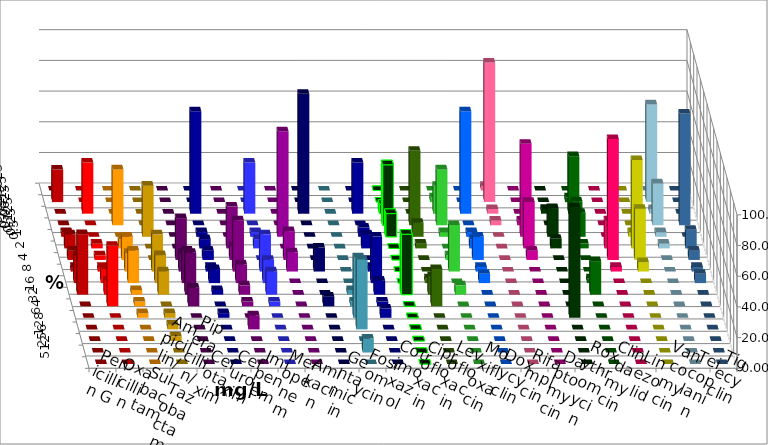
| Category | Penicillin G | Oxacillin | Ampicillin/ Sulbactam | Piperacillin/ Tazobactam | Cefotaxim | Cefuroxim | Imipenem | Meropenem | Amikacin | Gentamicin | Fosfomycin | Cotrimoxazol | Ciprofloxacin | Levofloxacin | Moxifloxacin | Doxycyclin | Rifampicin | Daptomycin | Roxythromycin | Clindamycin | Linezolid | Vancomycin | Teicoplanin | Tigecyclin |
|---|---|---|---|---|---|---|---|---|---|---|---|---|---|---|---|---|---|---|---|---|---|---|---|---|
| 0.015625 | 0 | 0 | 0 | 0 | 0 | 0 | 0 | 0 | 0 | 0 | 0 | 0 | 0 | 0 | 0 | 0 | 3.03 | 0 | 0 | 0 | 0 | 0 | 0 | 0 |
| 0.03125 | 21.212 | 0 | 0 | 0 | 0 | 0 | 0 | 0 | 0 | 0 | 0 | 0 | 0 | 0 | 3.03 | 0 | 90.909 | 0 | 0 | 3.125 | 0 | 0 | 0 | 63.636 |
| 0.0625 | 0 | 33.333 | 0 | 0 | 0 | 0 | 66.667 | 33.333 | 0 | 78.125 | 0 | 33.333 | 6.061 | 0 | 18.182 | 66.667 | 3.03 | 0 | 3.125 | 37.5 | 0 | 0 | 0 | 3.03 |
| 0.125 | 0 | 0 | 36.364 | 0 | 0 | 0 | 0 | 0 | 0 | 0 | 0 | 0 | 39.394 | 48.485 | 36.364 | 0 | 3.03 | 3.03 | 0 | 15.625 | 0 | 0 | 72.727 | 27.273 |
| 0.25 | 3.03 | 0 | 0 | 33.333 | 0 | 0 | 3.03 | 3.03 | 68.75 | 0 | 0 | 6.061 | 15.152 | 9.091 | 3.03 | 3.03 | 0 | 60.606 | 18.75 | 15.625 | 0 | 3.03 | 0 | 3.03 |
| 0.5 | 9.091 | 3.03 | 6.061 | 0 | 0 | 27.273 | 6.061 | 6.061 | 0 | 0 | 0 | 9.091 | 0 | 3.03 | 0 | 6.061 | 0 | 30.303 | 6.25 | 3.125 | 18.182 | 57.576 | 12.121 | 3.03 |
| 1.0 | 6.061 | 3.03 | 15.152 | 0 | 27.273 | 9.091 | 6.061 | 0 | 18.75 | 0 | 0 | 0 | 0 | 0 | 3.03 | 15.152 | 0 | 6.061 | 0 | 0 | 78.788 | 33.333 | 6.061 | 0 |
| 2.0 | 3.03 | 3.03 | 12.121 | 24.242 | 12.121 | 33.333 | 3.03 | 24.242 | 12.5 | 15.625 | 0 | 3.03 | 0 | 0 | 30.303 | 3.03 | 0 | 0 | 0 | 0 | 3.03 | 6.061 | 3.03 | 0 |
| 4.0 | 18.182 | 9.091 | 21.212 | 18.182 | 21.212 | 12.121 | 9.091 | 15.152 | 0 | 0 | 0 | 30.303 | 0 | 3.03 | 0 | 6.061 | 0 | 0 | 0 | 3.125 | 0 | 0 | 6.061 | 0 |
| 8.0 | 39.394 | 9.091 | 3.03 | 15.152 | 27.273 | 6.061 | 3.03 | 15.152 | 0 | 0 | 3.03 | 9.091 | 39.394 | 12.121 | 6.061 | 0 | 0 | 0 | 0 | 21.875 | 0 | 0 | 0 | 0 |
| 16.0 | 0 | 39.394 | 3.03 | 0 | 12.121 | 3.03 | 0 | 3.03 | 0 | 6.25 | 3.03 | 3.03 | 0 | 24.242 | 0 | 0 | 0 | 0 | 0 | 0 | 0 | 0 | 0 | 0 |
| 32.0 | 0 | 0 | 3.03 | 3.03 | 0 | 0 | 3.03 | 0 | 0 | 0 | 39.394 | 6.061 | 0 | 0 | 0 | 0 | 0 | 0 | 71.875 | 0 | 0 | 0 | 0 | 0 |
| 64.0 | 0 | 0 | 0 | 3.03 | 0 | 9.091 | 0 | 0 | 0 | 0 | 45.455 | 0 | 0 | 0 | 0 | 0 | 0 | 0 | 0 | 0 | 0 | 0 | 0 | 0 |
| 128.0 | 0 | 0 | 0 | 3.03 | 0 | 0 | 0 | 0 | 0 | 0 | 0 | 0 | 0 | 0 | 0 | 0 | 0 | 0 | 0 | 0 | 0 | 0 | 0 | 0 |
| 256.0 | 0 | 0 | 0 | 0 | 0 | 0 | 0 | 0 | 0 | 0 | 9.091 | 0 | 0 | 0 | 0 | 0 | 0 | 0 | 0 | 0 | 0 | 0 | 0 | 0 |
| 512.0 | 0 | 0 | 0 | 0 | 0 | 0 | 0 | 0 | 0 | 0 | 0 | 0 | 0 | 0 | 0 | 0 | 0 | 0 | 0 | 0 | 0 | 0 | 0 | 0 |